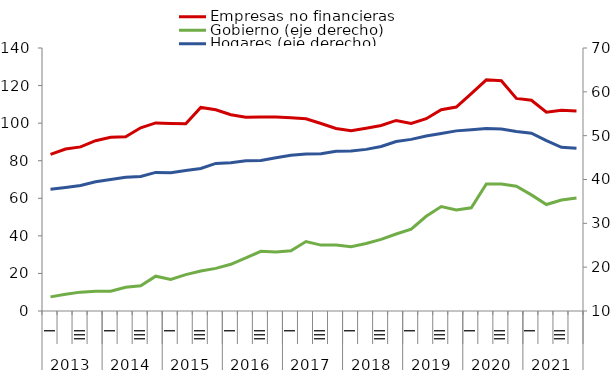
| Category | Empresas no financieras  |
|---|---|
| 0 | 83.37 |
| 1 | 86.225 |
| 2 | 87.367 |
| 3 | 90.656 |
| 4 | 92.436 |
| 5 | 92.789 |
| 6 | 97.526 |
| 7 | 100.137 |
| 8 | 99.842 |
| 9 | 99.634 |
| 10 | 108.349 |
| 11 | 107.148 |
| 12 | 104.451 |
| 13 | 103.113 |
| 14 | 103.211 |
| 15 | 103.226 |
| 16 | 102.827 |
| 17 | 102.353 |
| 18 | 99.792 |
| 19 | 97.192 |
| 20 | 95.915 |
| 21 | 97.239 |
| 22 | 98.733 |
| 23 | 101.441 |
| 24 | 99.878 |
| 25 | 102.347 |
| 26 | 107.123 |
| 27 | 108.591 |
| 28 | 115.761 |
| 29 | 123.073 |
| 30 | 122.535 |
| 31 | 113.171 |
| 32 | 112.199 |
| 33 | 105.847 |
| 34 | 106.8 |
| 35 | 106.448 |